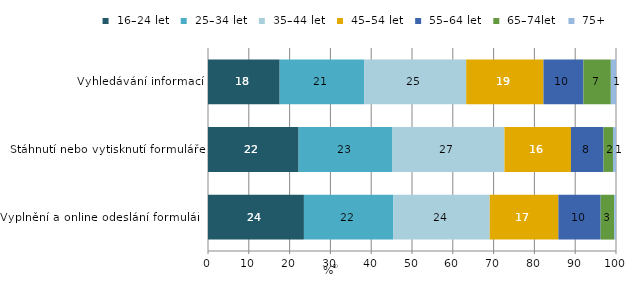
| Category |  16–24 let |  25–34 let |  35–44 let |  45–54 let |  55–64 let |  65–74let |  75+ |
|---|---|---|---|---|---|---|---|
| Vyplnění a online odeslání formuláře | 23.512 | 21.937 | 23.605 | 16.825 | 10.357 | 3.335 | 0.429 |
| Stáhnutí nebo vytisknutí formuláře | 22.207 | 23.016 | 27.435 | 16.298 | 7.987 | 2.333 | 0.732 |
| Vyhledávání informací | 17.569 | 20.688 | 25.025 | 18.934 | 9.805 | 6.713 | 1.266 |